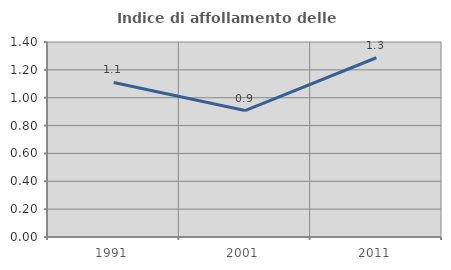
| Category | Indice di affollamento delle abitazioni  |
|---|---|
| 1991.0 | 1.109 |
| 2001.0 | 0.908 |
| 2011.0 | 1.287 |